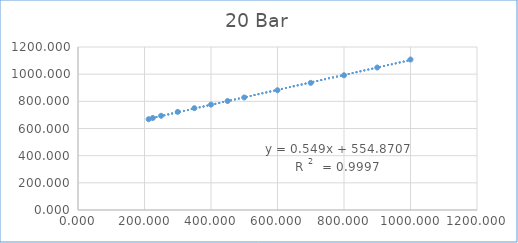
| Category | Series 0 |
|---|---|
| 212.4 | 668.49 |
| 225.0 | 677.52 |
| 250.0 | 693.55 |
| 300.0 | 722.456 |
| 350.0 | 749.57 |
| 400.0 | 775.991 |
| 450.0 | 802.246 |
| 500.0 | 828.524 |
| 600.0 | 881.677 |
| 700.0 | 936.025 |
| 800.0 | 991.758 |
| 900.0 | 1048.997 |
| 1000.0 | 1107.74 |